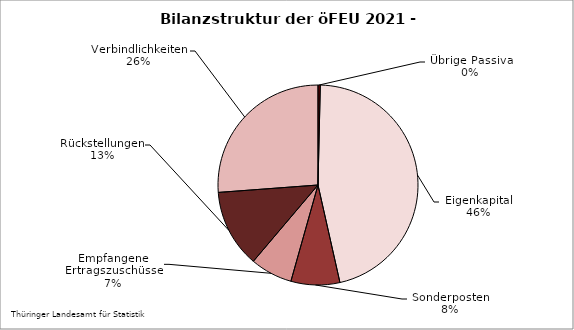
| Category | Series 0 |
|---|---|
| Übrige Passiva, Rechnungsab-grenzungsposten | 0.37 |
| Eigenkapital | 46.102 |
| SoPo mit Rücklageanteil, aus Zuwendungen und anderweitig nicht genannt | 7.897 |
| Empfangene Ertragszuschüsse | 6.815 |
| Rückstellungen | 12.629 |
| Verbindlichkeiten | 26.187 |